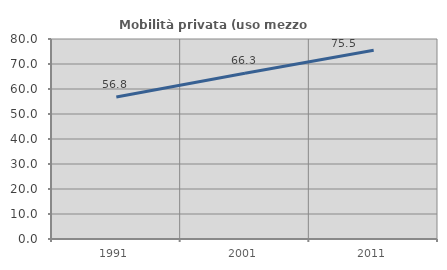
| Category | Mobilità privata (uso mezzo privato) |
|---|---|
| 1991.0 | 56.827 |
| 2001.0 | 66.306 |
| 2011.0 | 75.46 |